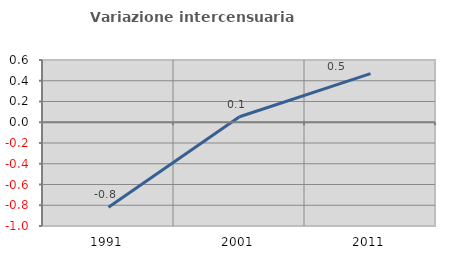
| Category | Variazione intercensuaria annua |
|---|---|
| 1991.0 | -0.818 |
| 2001.0 | 0.053 |
| 2011.0 | 0.469 |